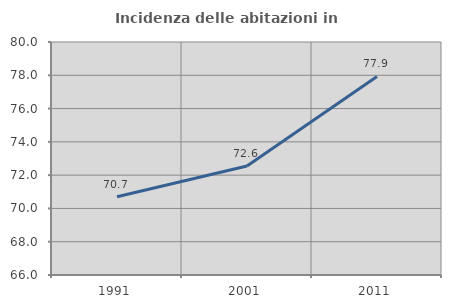
| Category | Incidenza delle abitazioni in proprietà  |
|---|---|
| 1991.0 | 70.697 |
| 2001.0 | 72.553 |
| 2011.0 | 77.932 |